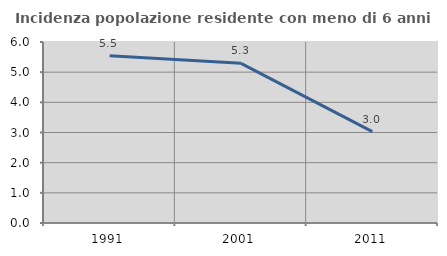
| Category | Incidenza popolazione residente con meno di 6 anni |
|---|---|
| 1991.0 | 5.544 |
| 2001.0 | 5.292 |
| 2011.0 | 3.027 |